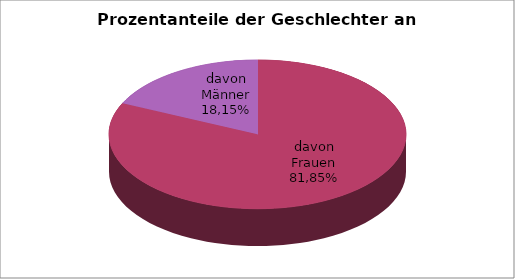
| Category | Series 0 |
|---|---|
| davon Frauen | 0.819 |
| davon Männer | 0.181 |